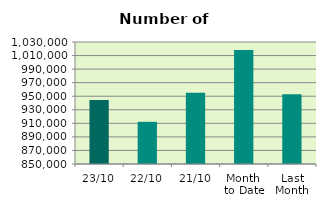
| Category | Series 0 |
|---|---|
| 23/10 | 944604 |
| 22/10 | 912240 |
| 21/10 | 955034 |
| Month 
to Date | 1018177.647 |
| Last
Month | 952931.048 |